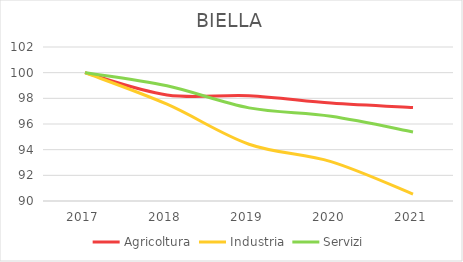
| Category | Agricoltura | Industria | Servizi |
|---|---|---|---|
| 2017.0 | 100 | 100 | 100 |
| 2018.0 | 98.265 | 97.54 | 98.979 |
| 2019.0 | 98.207 | 94.424 | 97.258 |
| 2020.0 | 97.629 | 93.071 | 96.601 |
| 2021.0 | 97.282 | 90.543 | 95.383 |